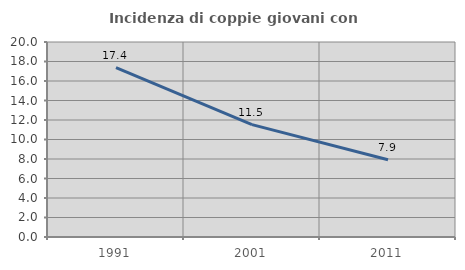
| Category | Incidenza di coppie giovani con figli |
|---|---|
| 1991.0 | 17.365 |
| 2001.0 | 11.521 |
| 2011.0 | 7.929 |